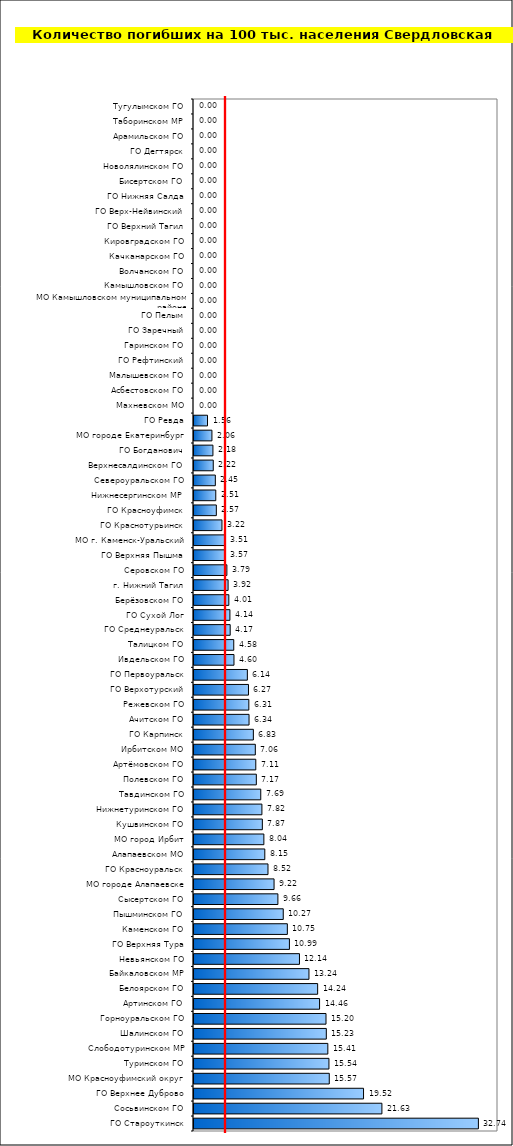
| Category | Series 0 |
|---|---|
| ГО Староуткинск | 32.744 |
| Сосьвинском ГО | 21.634 |
| ГО Верхнее Дуброво | 19.52 |
| МО Красноуфимский округ | 15.572 |
| Туринском ГО | 15.537 |
| Слободотуринском МР | 15.41 |
| Шалинском ГО | 15.233 |
| Горноуральском ГО | 15.199 |
| Артинском ГО | 14.458 |
| Белоярском ГО | 14.235 |
| Байкаловском МР | 13.236 |
| Невьянском ГО | 12.142 |
| ГО Верхняя Тура | 10.985 |
| Каменском ГО | 10.746 |
| Пышминском ГО | 10.274 |
| Сысертском ГО | 9.659 |
| МО городе Алапаевске | 9.217 |
| ГО Красноуральск | 8.52 |
| Алапаевском МО | 8.151 |
| МО город Ирбит | 8.044 |
| Кушвинском ГО | 7.867 |
| Нижнетуринском ГО | 7.818 |
| Тавдинском ГО | 7.686 |
| Полевском ГО | 7.174 |
| Артёмовском ГО | 7.114 |
| Ирбитском МО | 7.059 |
| ГО Карпинск | 6.832 |
| Ачитском ГО | 6.337 |
| Режевском ГО | 6.314 |
| ГО Верхотурский | 6.272 |
| ГО Первоуральск | 6.142 |
| Ивдельском ГО | 4.602 |
| Талицком ГО | 4.577 |
| ГО Среднеуральск | 4.166 |
| ГО Сухой Лог | 4.135 |
| Берёзовском ГО | 4.011 |
| г. Нижний Тагил | 3.924 |
| Серовском ГО | 3.785 |
| ГО Верхняя Пышма | 3.567 |
| МО г. Каменск-Уральский | 3.512 |
| ГО Краснотурьинск | 3.22 |
| ГО Красноуфимск | 2.57 |
| Нижнесергинском МР | 2.506 |
| Североуральском ГО | 2.455 |
| Верхнесалдинском ГО | 2.215 |
| ГО Богданович | 2.18 |
| МО городе Екатеринбург | 2.065 |
| ГО Ревда | 1.555 |
| Махневском МО | 0 |
| Асбестовском ГО | 0 |
| Малышевском ГО | 0 |
| ГО Рефтинский | 0 |
| Гаринском ГО | 0 |
| ГО Заречный | 0 |
| ГО Пелым | 0 |
| МО Камышловском муниципальном районе | 0 |
| Камышловском ГО | 0 |
| Волчанском ГО | 0 |
| Качканарском ГО | 0 |
| Кировградском ГО | 0 |
| ГО Верхний Тагил | 0 |
| ГО Верх-Нейвинский | 0 |
| ГО Нижняя Салда | 0 |
| Бисертском ГО | 0 |
| Новолялинском ГО | 0 |
| ГО Дегтярск | 0 |
| Арамильском ГО | 0 |
| Таборинском МР | 0 |
| Тугулымском ГО | 0 |